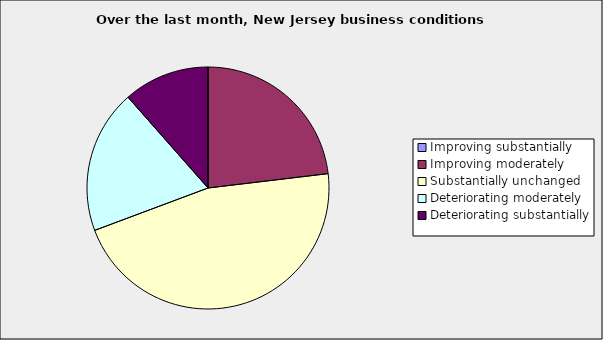
| Category | Series 0 |
|---|---|
| Improving substantially | 0 |
| Improving moderately | 0.231 |
| Substantially unchanged | 0.462 |
| Deteriorating moderately | 0.192 |
| Deteriorating substantially | 0.115 |